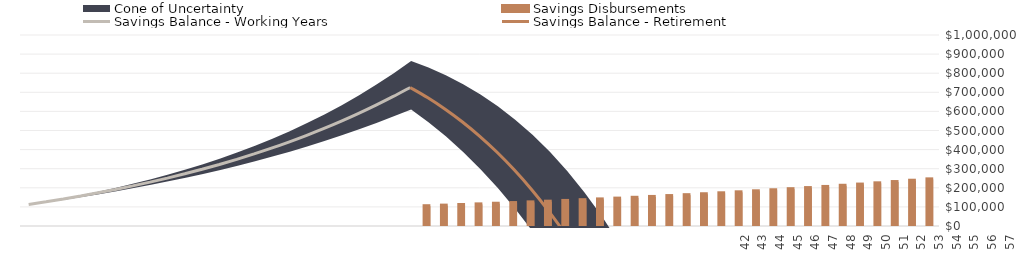
| Category |  Savings Disbursements |
|---|---|
| 0 | 0 |
| 1 | 0 |
| 2 | 0 |
| 3 | 0 |
| 4 | 0 |
| 5 | 0 |
| 6 | 0 |
| 7 | 0 |
| 8 | 0 |
| 9 | 0 |
| 10 | 0 |
| 11 | 0 |
| 12 | 0 |
| 13 | 0 |
| 14 | 0 |
| 15 | 0 |
| 16 | 0 |
| 17 | 0 |
| 18 | 0 |
| 19 | 0 |
| 20 | 0 |
| 21 | 0 |
| 22 | 0 |
| 23 | 103613.292 |
| 24 | 106721.691 |
| 25 | 109923.341 |
| 26 | 113221.042 |
| 27 | 116617.673 |
| 28 | 120116.203 |
| 29 | 123719.689 |
| 30 | 127431.28 |
| 31 | 131254.218 |
| 32 | 135191.845 |
| 33 | 139247.6 |
| 34 | 143425.028 |
| 35 | 147727.779 |
| 36 | 152159.612 |
| 37 | 156724.401 |
| 38 | 161426.133 |
| 39 | 166268.917 |
| 40 | 171256.984 |
| 41 | 176394.694 |
| 42 | 181686.534 |
| 43 | 187137.13 |
| 44 | 192751.244 |
| 45 | 198533.782 |
| 46 | 204489.795 |
| 47 | 210624.489 |
| 48 | 216943.224 |
| 49 | 223451.52 |
| 50 | 230155.066 |
| 51 | 237059.718 |
| 52 | 244171.51 |